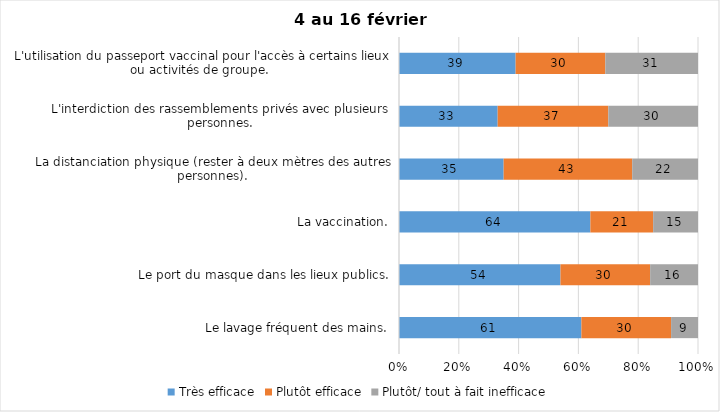
| Category | Très efficace | Plutôt efficace | Plutôt/ tout à fait inefficace |
|---|---|---|---|
| Le lavage fréquent des mains. | 61 | 30 | 9 |
| Le port du masque dans les lieux publics. | 54 | 30 | 16 |
| La vaccination. | 64 | 21 | 15 |
| La distanciation physique (rester à deux mètres des autres personnes). | 35 | 43 | 22 |
| L'interdiction des rassemblements privés avec plusieurs personnes. | 33 | 37 | 30 |
| L'utilisation du passeport vaccinal pour l'accès à certains lieux ou activités de groupe.  | 39 | 30 | 31 |